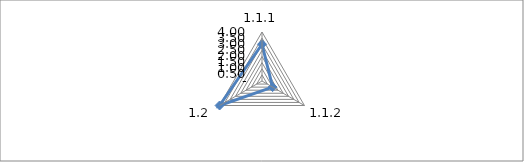
| Category | Series 0 |
|---|---|
| 1.1.1 | 3 |
| 1.1.2 | 1 |
| 1.2 | 4 |